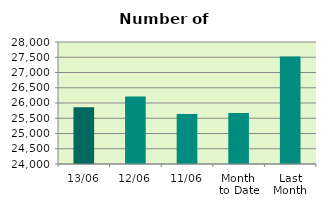
| Category | Series 0 |
|---|---|
| 13/06 | 25860 |
| 12/06 | 26216 |
| 11/06 | 25636 |
| Month 
to Date | 25676.222 |
| Last
Month | 27522.455 |